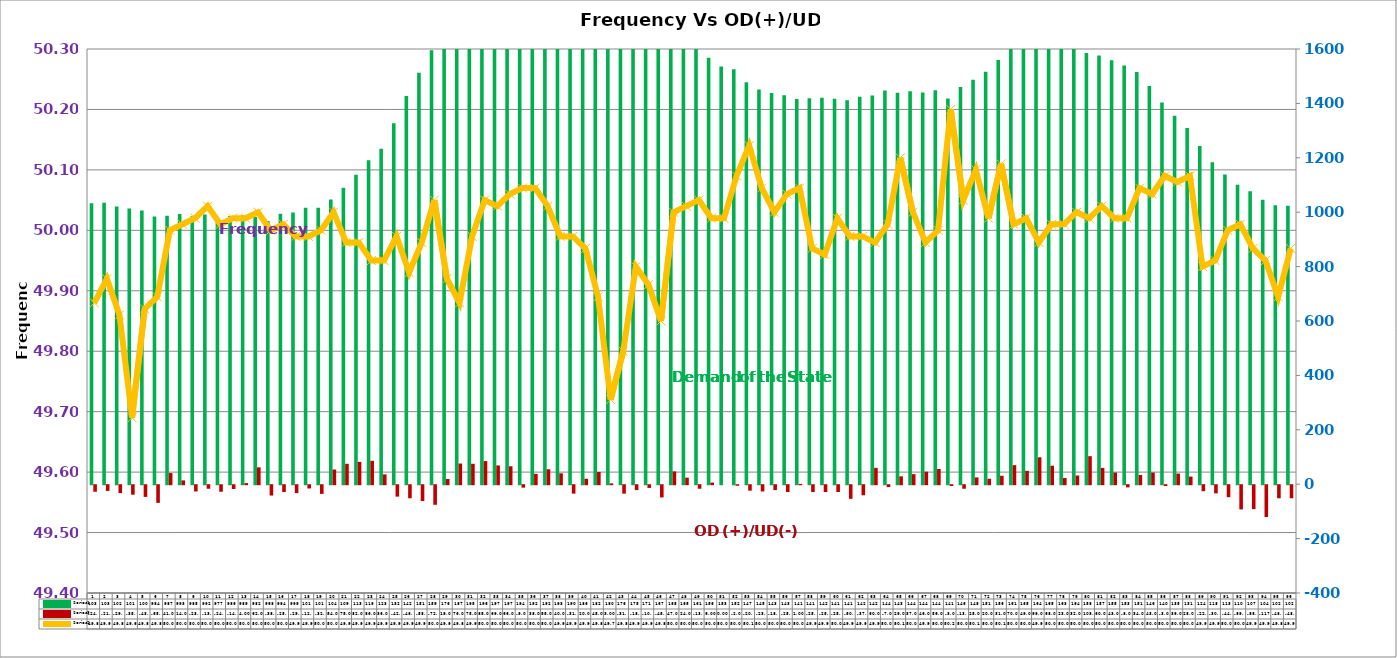
| Category | Series 2 | Series 4 |
|---|---|---|
| 0 | 1033 | -24 |
| 1 | 1035 | -21 |
| 2 | 1021 | -29 |
| 3 | 1014 | -35 |
| 4 | 1006 | -43 |
| 5 | 984 | -65 |
| 6 | 987 | 41 |
| 7 | 993 | 14 |
| 8 | 985 | -23 |
| 9 | 992 | -13 |
| 10 | 977 | -24 |
| 11 | 986 | -14 |
| 12 | 989 | 4 |
| 13 | 982 | 62 |
| 14 | 968 | -38 |
| 15 | 994 | -25 |
| 16 | 999 | -29 |
| 17 | 1016 | -12 |
| 18 | 1016 | -32 |
| 19 | 1047 | 54 |
| 20 | 1090 | 75 |
| 21 | 1138 | 82 |
| 22 | 1191 | 86 |
| 23 | 1233 | 36 |
| 24 | 1327 | -42 |
| 25 | 1427 | -48 |
| 26 | 1513 | -58 |
| 27 | 1595 | -72 |
| 28 | 1764 | 19 |
| 29 | 1878 | 76 |
| 30 | 1955 | 75 |
| 31 | 1968 | 85 |
| 32 | 1973 | 69 |
| 33 | 1977 | 66 |
| 34 | 1942 | -9 |
| 35 | 1922 | 38 |
| 36 | 1929 | 55 |
| 37 | 1935 | 40 |
| 38 | 1904 | -31 |
| 39 | 1863 | 20 |
| 40 | 1827 | 45 |
| 41 | 1806 | 3 |
| 42 | 1766 | -31 |
| 43 | 1758 | -18 |
| 44 | 1716 | -10 |
| 45 | 1673 | -45 |
| 46 | 1652 | 47 |
| 47 | 1652 | 24 |
| 48 | 1619 | -13 |
| 49 | 1568 | 6 |
| 50 | 1536 | 0 |
| 51 | 1526 | -2 |
| 52 | 1478 | -20 |
| 53 | 1451 | -23 |
| 54 | 1438 | -18 |
| 55 | 1430 | -25 |
| 56 | 1416 | 1 |
| 57 | 1419 | -25 |
| 58 | 1421 | -25 |
| 59 | 1417 | -25 |
| 60 | 1412 | -50 |
| 61 | 1424 | -37 |
| 62 | 1429 | 60 |
| 63 | 1447 | -7 |
| 64 | 1439 | 29 |
| 65 | 1445 | 37 |
| 66 | 1440 | 46 |
| 67 | 1448 | 56 |
| 68 | 1418 | -3 |
| 69 | 1460 | -13 |
| 70 | 1487 | 25 |
| 71 | 1516 | 20 |
| 72 | 1560 | 31 |
| 73 | 1618 | 70 |
| 74 | 1657 | 49 |
| 75 | 1640 | 99 |
| 76 | 1659 | 68 |
| 77 | 1633 | 23 |
| 78 | 1641 | 32 |
| 79 | 1585 | 103 |
| 80 | 1576 | 60 |
| 81 | 1559 | 43 |
| 82 | 1539 | -8 |
| 83 | 1515 | 34 |
| 84 | 1464 | 43 |
| 85 | 1403 | -3 |
| 86 | 1355 | 39 |
| 87 | 1310 | 28 |
| 88 | 1243 | -22 |
| 89 | 1184 | -30 |
| 90 | 1139 | -44 |
| 91 | 1101 | -89 |
| 92 | 1077 | -88 |
| 93 | 1046 | -117 |
| 94 | 1026 | -48 |
| 95 | 1024 | -48 |